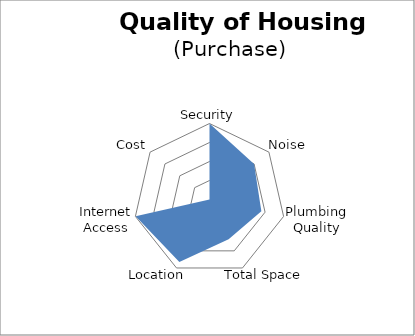
| Category | Series 0 |
|---|---|
| Security | 100 |
| Noise | 75 |
| Plumbing Quality | 70 |
| Total Space | 57.965 |
| Location | 91.393 |
| Internet Access | 99.734 |
| Cost | 0 |